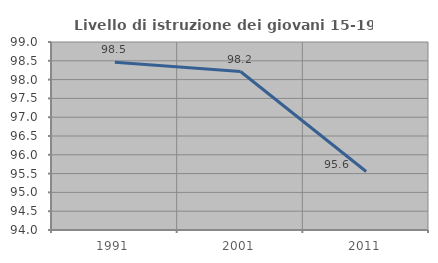
| Category | Livello di istruzione dei giovani 15-19 anni |
|---|---|
| 1991.0 | 98.462 |
| 2001.0 | 98.214 |
| 2011.0 | 95.556 |